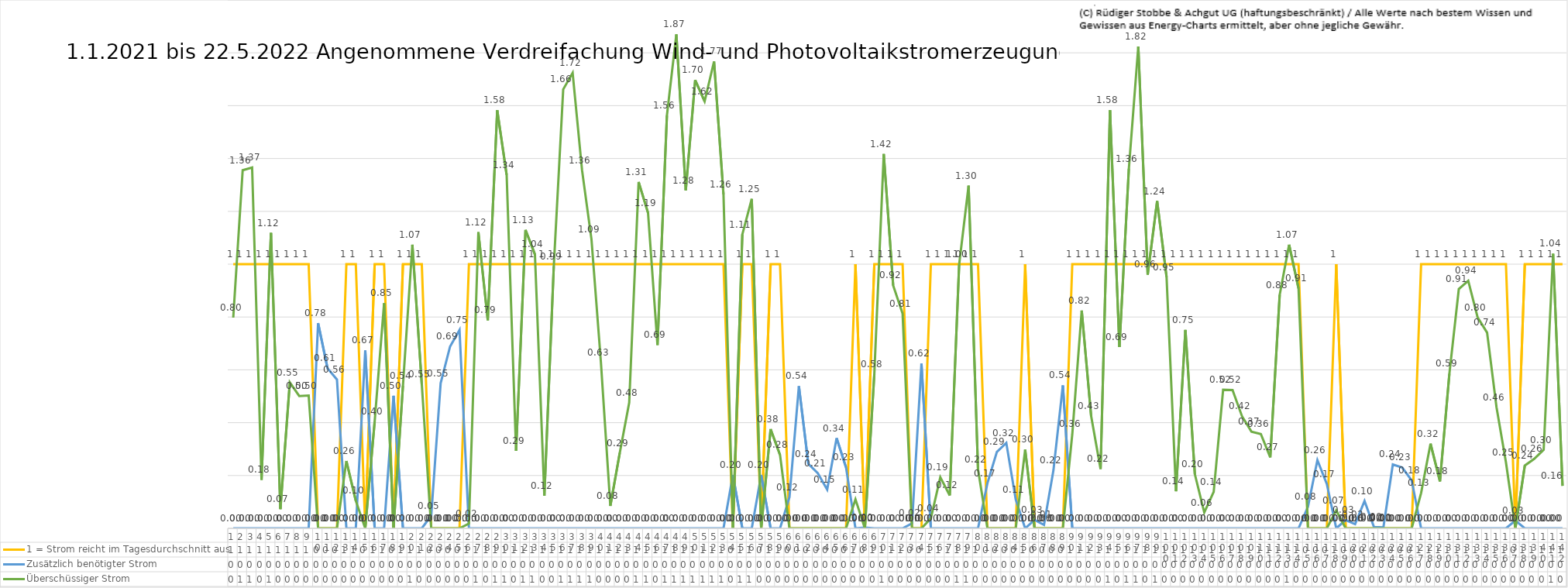
| Category | 1 = Strom reicht im Tagesdurchschnitt aus | Zusätzlich benötigter Strom | Überschüssiger Strom |
|---|---|---|---|
| 0 | 1 | 0 | 0.798 |
| 1 | 1 | 0 | 1.356 |
| 2 | 1 | 0 | 1.366 |
| 3 | 1 | 0 | 0.184 |
| 4 | 1 | 0 | 1.118 |
| 5 | 1 | 0 | 0.073 |
| 6 | 1 | 0 | 0.553 |
| 7 | 1 | 0 | 0.501 |
| 8 | 1 | 0 | 0.503 |
| 9 | 0 | 0.777 | 0 |
| 10 | 0 | 0.606 | 0 |
| 11 | 0 | 0.563 | 0 |
| 12 | 1 | 0 | 0.255 |
| 13 | 1 | 0 | 0.104 |
| 14 | 0 | 0.673 | 0 |
| 15 | 1 | 0 | 0.405 |
| 16 | 1 | 0 | 0.852 |
| 17 | 0 | 0.502 | 0 |
| 18 | 1 | 0 | 0.54 |
| 19 | 1 | 0 | 1.074 |
| 20 | 1 | 0 | 0.546 |
| 21 | 0 | 0.048 | 0 |
| 22 | 0 | 0.55 | 0 |
| 23 | 0 | 0.688 | 0 |
| 24 | 0 | 0.751 | 0 |
| 25 | 1 | 0 | 0.018 |
| 26 | 1 | 0 | 1.121 |
| 27 | 1 | 0 | 0.788 |
| 28 | 1 | 0 | 1.583 |
| 29 | 1 | 0 | 1.338 |
| 30 | 1 | 0 | 0.293 |
| 31 | 1 | 0 | 1.13 |
| 32 | 1 | 0 | 1.037 |
| 33 | 1 | 0 | 0.123 |
| 34 | 1 | 0 | 0.992 |
| 35 | 1 | 0 | 1.662 |
| 36 | 1 | 0 | 1.724 |
| 37 | 1 | 0 | 1.355 |
| 38 | 1 | 0 | 1.094 |
| 39 | 1 | 0 | 0.628 |
| 40 | 1 | 0 | 0.085 |
| 41 | 1 | 0 | 0.286 |
| 42 | 1 | 0 | 0.476 |
| 43 | 1 | 0 | 1.311 |
| 44 | 1 | 0 | 1.194 |
| 45 | 1 | 0 | 0.694 |
| 46 | 1 | 0 | 1.563 |
| 47 | 1 | 0 | 1.87 |
| 48 | 1 | 0 | 1.28 |
| 49 | 1 | 0 | 1.697 |
| 50 | 1 | 0 | 1.616 |
| 51 | 1 | 0 | 1.767 |
| 52 | 1 | 0 | 1.264 |
| 53 | 0 | 0.202 | 0 |
| 54 | 1 | 0 | 1.112 |
| 55 | 1 | 0 | 1.247 |
| 56 | 0 | 0.202 | 0 |
| 57 | 1 | 0 | 0.376 |
| 58 | 1 | 0 | 0.278 |
| 59 | 0 | 0.118 | 0 |
| 60 | 0 | 0.538 | 0 |
| 61 | 0 | 0.244 | 0 |
| 62 | 0 | 0.209 | 0 |
| 63 | 0 | 0.147 | 0 |
| 64 | 0 | 0.341 | 0 |
| 65 | 0 | 0.231 | 0 |
| 66 | 1 | 0 | 0.11 |
| 67 | 0 | 0.003 | 0 |
| 68 | 1 | 0 | 0.584 |
| 69 | 1 | 0 | 1.417 |
| 70 | 1 | 0 | 0.92 |
| 71 | 1 | 0 | 0.813 |
| 72 | 0 | 0.019 | 0 |
| 73 | 0 | 0.624 | 0 |
| 74 | 1 | 0 | 0.038 |
| 75 | 1 | 0 | 0.193 |
| 76 | 1 | 0 | 0.125 |
| 77 | 1 | 0 | 0.999 |
| 78 | 1 | 0 | 1.297 |
| 79 | 1 | 0 | 0.224 |
| 80 | 0 | 0.171 | 0 |
| 81 | 0 | 0.289 | 0 |
| 82 | 0 | 0.323 | 0 |
| 83 | 0 | 0.11 | 0 |
| 84 | 1 | 0 | 0.298 |
| 85 | 0 | 0.032 | 0 |
| 86 | 0 | 0.013 | 0 |
| 87 | 0 | 0.22 | 0 |
| 88 | 0 | 0.541 | 0 |
| 89 | 1 | 0 | 0.357 |
| 90 | 1 | 0 | 0.825 |
| 91 | 1 | 0 | 0.425 |
| 92 | 1 | 0 | 0.225 |
| 93 | 1 | 0 | 1.583 |
| 94 | 1 | 0 | 0.686 |
| 95 | 1 | 0 | 1.361 |
| 96 | 1 | 0 | 1.824 |
| 97 | 1 | 0 | 0.96 |
| 98 | 1 | 0 | 1.239 |
| 99 | 1 | 0 | 0.951 |
| 100 | 1 | 0 | 0.14 |
| 101 | 1 | 0 | 0.751 |
| 102 | 1 | 0 | 0.205 |
| 103 | 1 | 0 | 0.06 |
| 104 | 1 | 0 | 0.138 |
| 105 | 1 | 0 | 0.525 |
| 106 | 1 | 0 | 0.524 |
| 107 | 1 | 0 | 0.425 |
| 108 | 1 | 0 | 0.366 |
| 109 | 1 | 0 | 0.357 |
| 110 | 1 | 0 | 0.269 |
| 111 | 1 | 0 | 0.884 |
| 112 | 1 | 0 | 1.074 |
| 113 | 1 | 0 | 0.908 |
| 114 | 0 | 0.082 | 0 |
| 115 | 0 | 0.258 | 0 |
| 116 | 0 | 0.168 | 0 |
| 117 | 1 | 0 | 0.068 |
| 118 | 0 | 0.031 | 0 |
| 119 | 0 | 0.016 | 0 |
| 120 | 0 | 0.104 | 0 |
| 121 | 0 | 0.005 | 0 |
| 122 | 0 | 0.003 | 0 |
| 123 | 0 | 0.242 | 0 |
| 124 | 0 | 0.23 | 0 |
| 125 | 0 | 0.181 | 0 |
| 126 | 1 | 0 | 0.134 |
| 127 | 1 | 0 | 0.321 |
| 128 | 1 | 0 | 0.178 |
| 129 | 1 | 0 | 0.585 |
| 130 | 1 | 0 | 0.906 |
| 131 | 1 | 0 | 0.937 |
| 132 | 1 | 0 | 0.798 |
| 133 | 1 | 0 | 0.741 |
| 134 | 1 | 0 | 0.458 |
| 135 | 1 | 0 | 0.25 |
| 136 | 0 | 0.03 | 0 |
| 137 | 1 | 0 | 0.238 |
| 138 | 1 | 0 | 0.263 |
| 139 | 1 | 0 | 0.298 |
| 140 | 1 | 0 | 1.04 |
| 141 | 1 | 0 | 0.161 |